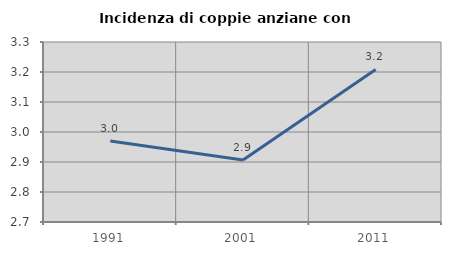
| Category | Incidenza di coppie anziane con figli |
|---|---|
| 1991.0 | 2.97 |
| 2001.0 | 2.907 |
| 2011.0 | 3.209 |